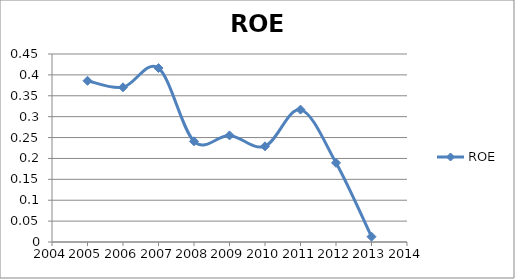
| Category | ROE |
|---|---|
| 2005.0 | 0.386 |
| 2006.0 | 0.37 |
| 2007.0 | 0.416 |
| 2008.0 | 0.241 |
| 2009.0 | 0.255 |
| 2010.0 | 0.229 |
| 2011.0 | 0.317 |
| 2012.0 | 0.189 |
| 2013.0 | 0.013 |